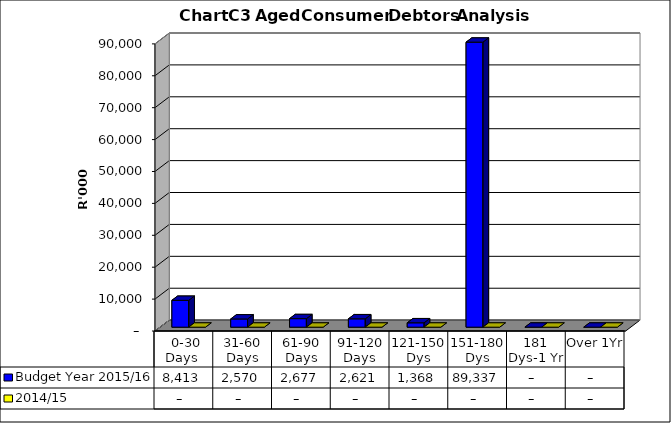
| Category | Budget Year 2015/16 | 2014/15 |
|---|---|---|
|  0-30 Days  | 8412634 | 0 |
| 31-60 Days | 2570257 | 0 |
| 61-90 Days | 2676931 | 0 |
| 91-120 Days | 2620688 | 0 |
| 121-150 Dys | 1368257 | 0 |
| 151-180 Dys | 89336960 | 0 |
| 181 Dys-1 Yr | 0 | 0 |
| Over 1Yr | 0 | 0 |